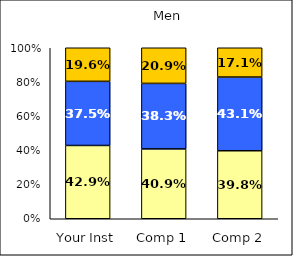
| Category | Low Institutional Priority: Civic Engagement | Average Institutional Priority: Civic Engagement | High Institutional Priority: Civic Engagement |
|---|---|---|---|
| Your Inst | 0.429 | 0.375 | 0.196 |
| Comp 1 | 0.409 | 0.383 | 0.209 |
| Comp 2 | 0.398 | 0.431 | 0.171 |